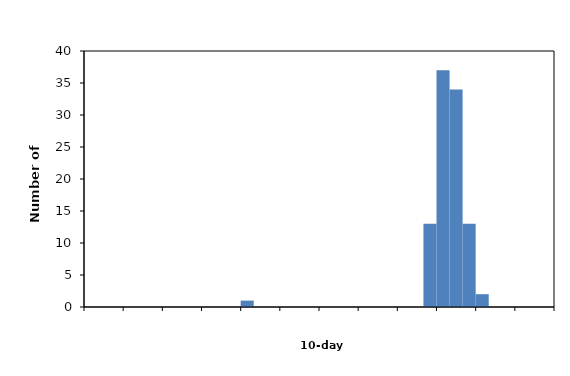
| Category | Series 0 |
|---|---|
|  | 0 |
| J | 0 |
|  | 0 |
|  | 0 |
| F | 0 |
|  | 0 |
|  | 0 |
| M | 0 |
|  | 0 |
|  | 0 |
| A | 0 |
|  | 0 |
|  | 1 |
| M | 0 |
|  | 0 |
|  | 0 |
| J | 0 |
|  | 0 |
|  | 0 |
| J | 0 |
|  | 0 |
|  | 0 |
| A | 0 |
|  | 0 |
|  | 0 |
| S | 0 |
|  | 13 |
|  | 37 |
| O | 34 |
|  | 13 |
|  | 2 |
| N | 0 |
|  | 0 |
|  | 0 |
| D | 0 |